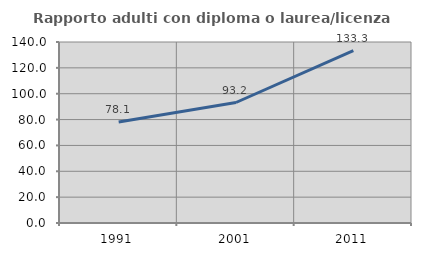
| Category | Rapporto adulti con diploma o laurea/licenza media  |
|---|---|
| 1991.0 | 78.082 |
| 2001.0 | 93.204 |
| 2011.0 | 133.333 |